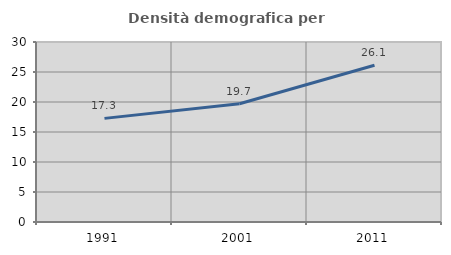
| Category | Densità demografica |
|---|---|
| 1991.0 | 17.271 |
| 2001.0 | 19.712 |
| 2011.0 | 26.135 |